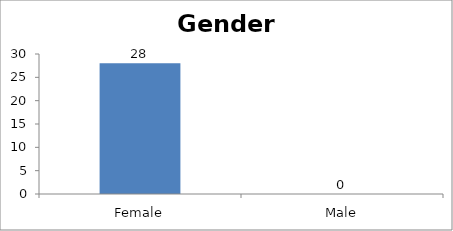
| Category | Gender |
|---|---|
| Female | 28 |
| Male | 0 |